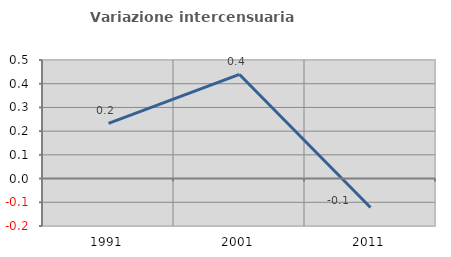
| Category | Variazione intercensuaria annua |
|---|---|
| 1991.0 | 0.233 |
| 2001.0 | 0.439 |
| 2011.0 | -0.122 |